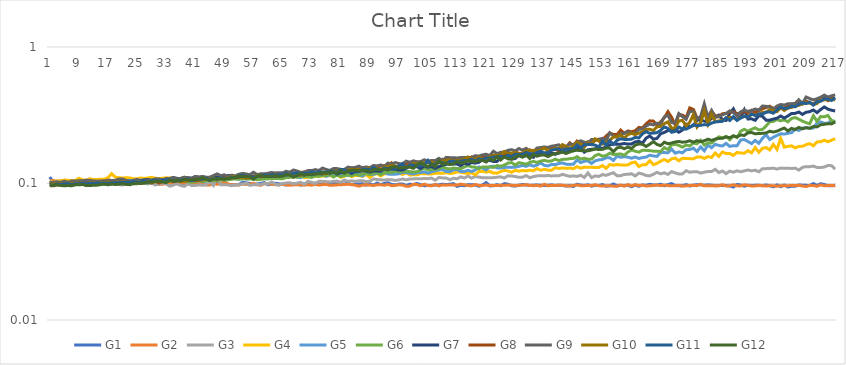
| Category | G1 | G2 | G3 | G4 | G5 | G6 | G7 | G8 | G9 | G10 | G11 | G12 |
|---|---|---|---|---|---|---|---|---|---|---|---|---|
| 0 | 0.112 | 0.105 | 0.104 | 0.104 | 0.103 | 0.099 | 0.1 | 0.096 | 0.102 | 0.099 | 0.098 | 0.098 |
| 1 | 0.101 | 0.105 | 0.103 | 0.102 | 0.101 | 0.099 | 0.1 | 0.096 | 0.102 | 0.1 | 0.097 | 0.097 |
| 2 | 0.102 | 0.103 | 0.104 | 0.105 | 0.102 | 0.098 | 0.101 | 0.098 | 0.103 | 0.1 | 0.099 | 0.098 |
| 3 | 0.103 | 0.105 | 0.099 | 0.104 | 0.102 | 0.098 | 0.101 | 0.098 | 0.102 | 0.1 | 0.099 | 0.097 |
| 4 | 0.102 | 0.105 | 0.102 | 0.106 | 0.102 | 0.098 | 0.101 | 0.098 | 0.104 | 0.1 | 0.1 | 0.096 |
| 5 | 0.103 | 0.105 | 0.102 | 0.106 | 0.102 | 0.099 | 0.101 | 0.099 | 0.102 | 0.1 | 0.1 | 0.097 |
| 6 | 0.104 | 0.104 | 0.101 | 0.105 | 0.101 | 0.099 | 0.101 | 0.098 | 0.104 | 0.101 | 0.098 | 0.096 |
| 7 | 0.105 | 0.105 | 0.1 | 0.105 | 0.102 | 0.099 | 0.101 | 0.098 | 0.104 | 0.1 | 0.1 | 0.098 |
| 8 | 0.104 | 0.106 | 0.1 | 0.109 | 0.103 | 0.098 | 0.102 | 0.098 | 0.105 | 0.101 | 0.1 | 0.098 |
| 9 | 0.104 | 0.104 | 0.099 | 0.106 | 0.103 | 0.099 | 0.101 | 0.1 | 0.105 | 0.1 | 0.1 | 0.098 |
| 10 | 0.103 | 0.104 | 0.106 | 0.105 | 0.103 | 0.098 | 0.102 | 0.099 | 0.106 | 0.1 | 0.099 | 0.096 |
| 11 | 0.102 | 0.108 | 0.1 | 0.108 | 0.103 | 0.099 | 0.102 | 0.099 | 0.105 | 0.101 | 0.1 | 0.097 |
| 12 | 0.101 | 0.104 | 0.1 | 0.107 | 0.102 | 0.099 | 0.101 | 0.1 | 0.104 | 0.101 | 0.1 | 0.097 |
| 13 | 0.103 | 0.105 | 0.101 | 0.107 | 0.103 | 0.1 | 0.103 | 0.101 | 0.104 | 0.1 | 0.101 | 0.097 |
| 14 | 0.101 | 0.107 | 0.102 | 0.108 | 0.103 | 0.1 | 0.102 | 0.1 | 0.104 | 0.101 | 0.1 | 0.098 |
| 15 | 0.1 | 0.105 | 0.1 | 0.108 | 0.102 | 0.099 | 0.103 | 0.1 | 0.105 | 0.102 | 0.101 | 0.099 |
| 16 | 0.103 | 0.102 | 0.099 | 0.11 | 0.103 | 0.101 | 0.104 | 0.099 | 0.106 | 0.102 | 0.1 | 0.098 |
| 17 | 0.101 | 0.104 | 0.1 | 0.118 | 0.104 | 0.102 | 0.104 | 0.101 | 0.105 | 0.101 | 0.101 | 0.099 |
| 18 | 0.102 | 0.106 | 0.1 | 0.111 | 0.104 | 0.1 | 0.103 | 0.101 | 0.105 | 0.102 | 0.102 | 0.098 |
| 19 | 0.101 | 0.104 | 0.099 | 0.11 | 0.104 | 0.102 | 0.103 | 0.101 | 0.108 | 0.103 | 0.101 | 0.099 |
| 20 | 0.101 | 0.104 | 0.097 | 0.11 | 0.104 | 0.101 | 0.104 | 0.101 | 0.108 | 0.103 | 0.102 | 0.1 |
| 21 | 0.102 | 0.104 | 0.099 | 0.11 | 0.105 | 0.1 | 0.105 | 0.101 | 0.105 | 0.103 | 0.102 | 0.098 |
| 22 | 0.099 | 0.104 | 0.1 | 0.11 | 0.106 | 0.101 | 0.104 | 0.1 | 0.103 | 0.102 | 0.102 | 0.098 |
| 23 | 0.101 | 0.101 | 0.099 | 0.108 | 0.104 | 0.102 | 0.104 | 0.101 | 0.106 | 0.102 | 0.103 | 0.1 |
| 24 | 0.1 | 0.104 | 0.099 | 0.108 | 0.104 | 0.101 | 0.106 | 0.101 | 0.106 | 0.102 | 0.102 | 0.1 |
| 25 | 0.101 | 0.1 | 0.102 | 0.11 | 0.106 | 0.101 | 0.104 | 0.101 | 0.103 | 0.101 | 0.102 | 0.1 |
| 26 | 0.101 | 0.102 | 0.108 | 0.109 | 0.105 | 0.101 | 0.106 | 0.101 | 0.104 | 0.102 | 0.104 | 0.101 |
| 27 | 0.1 | 0.101 | 0.1 | 0.11 | 0.104 | 0.101 | 0.107 | 0.103 | 0.105 | 0.103 | 0.102 | 0.103 |
| 28 | 0.101 | 0.103 | 0.1 | 0.111 | 0.106 | 0.102 | 0.105 | 0.101 | 0.105 | 0.102 | 0.105 | 0.102 |
| 29 | 0.101 | 0.101 | 0.098 | 0.109 | 0.106 | 0.103 | 0.108 | 0.104 | 0.108 | 0.104 | 0.104 | 0.104 |
| 30 | 0.099 | 0.099 | 0.099 | 0.109 | 0.107 | 0.103 | 0.106 | 0.101 | 0.108 | 0.103 | 0.104 | 0.104 |
| 31 | 0.102 | 0.099 | 0.101 | 0.109 | 0.106 | 0.103 | 0.107 | 0.103 | 0.106 | 0.105 | 0.105 | 0.103 |
| 32 | 0.102 | 0.1 | 0.099 | 0.11 | 0.107 | 0.105 | 0.108 | 0.103 | 0.108 | 0.103 | 0.106 | 0.102 |
| 33 | 0.101 | 0.101 | 0.096 | 0.11 | 0.107 | 0.104 | 0.108 | 0.106 | 0.109 | 0.105 | 0.106 | 0.106 |
| 34 | 0.103 | 0.1 | 0.097 | 0.11 | 0.106 | 0.104 | 0.11 | 0.103 | 0.11 | 0.105 | 0.105 | 0.104 |
| 35 | 0.1 | 0.101 | 0.1 | 0.108 | 0.106 | 0.103 | 0.109 | 0.104 | 0.108 | 0.105 | 0.105 | 0.106 |
| 36 | 0.101 | 0.101 | 0.097 | 0.109 | 0.108 | 0.105 | 0.108 | 0.105 | 0.109 | 0.104 | 0.106 | 0.104 |
| 37 | 0.1 | 0.101 | 0.095 | 0.111 | 0.108 | 0.104 | 0.111 | 0.105 | 0.111 | 0.105 | 0.107 | 0.107 |
| 38 | 0.099 | 0.1 | 0.1 | 0.11 | 0.107 | 0.103 | 0.11 | 0.105 | 0.108 | 0.105 | 0.107 | 0.106 |
| 39 | 0.101 | 0.099 | 0.097 | 0.108 | 0.108 | 0.102 | 0.11 | 0.106 | 0.108 | 0.106 | 0.105 | 0.106 |
| 40 | 0.1 | 0.099 | 0.097 | 0.108 | 0.108 | 0.103 | 0.112 | 0.105 | 0.112 | 0.107 | 0.107 | 0.108 |
| 41 | 0.099 | 0.1 | 0.098 | 0.111 | 0.107 | 0.105 | 0.111 | 0.106 | 0.112 | 0.106 | 0.107 | 0.107 |
| 42 | 0.1 | 0.099 | 0.097 | 0.11 | 0.107 | 0.104 | 0.112 | 0.106 | 0.112 | 0.108 | 0.108 | 0.111 |
| 43 | 0.099 | 0.098 | 0.098 | 0.109 | 0.107 | 0.105 | 0.111 | 0.109 | 0.111 | 0.107 | 0.109 | 0.108 |
| 44 | 0.098 | 0.097 | 0.103 | 0.109 | 0.108 | 0.107 | 0.11 | 0.107 | 0.111 | 0.108 | 0.106 | 0.105 |
| 45 | 0.101 | 0.1 | 0.097 | 0.107 | 0.109 | 0.105 | 0.112 | 0.11 | 0.114 | 0.11 | 0.109 | 0.108 |
| 46 | 0.1 | 0.099 | 0.111 | 0.111 | 0.107 | 0.105 | 0.111 | 0.107 | 0.118 | 0.108 | 0.108 | 0.109 |
| 47 | 0.099 | 0.1 | 0.098 | 0.107 | 0.108 | 0.107 | 0.111 | 0.11 | 0.114 | 0.11 | 0.11 | 0.108 |
| 48 | 0.1 | 0.102 | 0.098 | 0.111 | 0.107 | 0.106 | 0.112 | 0.11 | 0.116 | 0.108 | 0.108 | 0.108 |
| 49 | 0.098 | 0.099 | 0.098 | 0.109 | 0.108 | 0.106 | 0.114 | 0.109 | 0.112 | 0.11 | 0.109 | 0.109 |
| 50 | 0.098 | 0.098 | 0.096 | 0.109 | 0.109 | 0.107 | 0.114 | 0.11 | 0.115 | 0.112 | 0.111 | 0.11 |
| 51 | 0.098 | 0.098 | 0.098 | 0.11 | 0.109 | 0.108 | 0.11 | 0.11 | 0.114 | 0.112 | 0.11 | 0.111 |
| 52 | 0.098 | 0.097 | 0.098 | 0.113 | 0.108 | 0.108 | 0.112 | 0.111 | 0.117 | 0.114 | 0.114 | 0.113 |
| 53 | 0.102 | 0.099 | 0.099 | 0.11 | 0.109 | 0.108 | 0.114 | 0.113 | 0.119 | 0.11 | 0.115 | 0.112 |
| 54 | 0.101 | 0.098 | 0.101 | 0.11 | 0.108 | 0.108 | 0.114 | 0.11 | 0.118 | 0.111 | 0.113 | 0.113 |
| 55 | 0.1 | 0.099 | 0.097 | 0.111 | 0.109 | 0.108 | 0.111 | 0.11 | 0.116 | 0.111 | 0.112 | 0.112 |
| 56 | 0.099 | 0.1 | 0.098 | 0.114 | 0.11 | 0.108 | 0.113 | 0.112 | 0.121 | 0.111 | 0.111 | 0.107 |
| 57 | 0.099 | 0.098 | 0.098 | 0.11 | 0.109 | 0.106 | 0.115 | 0.113 | 0.116 | 0.114 | 0.112 | 0.113 |
| 58 | 0.1 | 0.097 | 0.098 | 0.11 | 0.11 | 0.107 | 0.113 | 0.112 | 0.118 | 0.114 | 0.114 | 0.115 |
| 59 | 0.102 | 0.1 | 0.1 | 0.109 | 0.11 | 0.108 | 0.114 | 0.113 | 0.118 | 0.114 | 0.115 | 0.112 |
| 60 | 0.098 | 0.099 | 0.099 | 0.112 | 0.112 | 0.108 | 0.114 | 0.113 | 0.119 | 0.113 | 0.114 | 0.113 |
| 61 | 0.099 | 0.099 | 0.103 | 0.114 | 0.111 | 0.109 | 0.113 | 0.117 | 0.12 | 0.115 | 0.116 | 0.113 |
| 62 | 0.1 | 0.098 | 0.099 | 0.112 | 0.111 | 0.109 | 0.113 | 0.113 | 0.12 | 0.116 | 0.115 | 0.114 |
| 63 | 0.1 | 0.098 | 0.097 | 0.11 | 0.111 | 0.109 | 0.114 | 0.118 | 0.12 | 0.114 | 0.116 | 0.113 |
| 64 | 0.099 | 0.098 | 0.1 | 0.113 | 0.111 | 0.108 | 0.117 | 0.118 | 0.12 | 0.114 | 0.116 | 0.113 |
| 65 | 0.097 | 0.098 | 0.101 | 0.111 | 0.112 | 0.11 | 0.115 | 0.12 | 0.123 | 0.118 | 0.119 | 0.117 |
| 66 | 0.1 | 0.097 | 0.101 | 0.112 | 0.112 | 0.111 | 0.116 | 0.117 | 0.121 | 0.115 | 0.115 | 0.116 |
| 67 | 0.1 | 0.098 | 0.099 | 0.112 | 0.114 | 0.112 | 0.115 | 0.118 | 0.126 | 0.115 | 0.119 | 0.111 |
| 68 | 0.1 | 0.098 | 0.101 | 0.113 | 0.111 | 0.111 | 0.115 | 0.118 | 0.124 | 0.117 | 0.119 | 0.115 |
| 69 | 0.097 | 0.098 | 0.102 | 0.114 | 0.11 | 0.112 | 0.117 | 0.115 | 0.121 | 0.117 | 0.118 | 0.118 |
| 70 | 0.099 | 0.097 | 0.099 | 0.11 | 0.113 | 0.113 | 0.115 | 0.122 | 0.121 | 0.118 | 0.119 | 0.115 |
| 71 | 0.1 | 0.098 | 0.104 | 0.111 | 0.114 | 0.112 | 0.12 | 0.118 | 0.124 | 0.118 | 0.118 | 0.116 |
| 72 | 0.099 | 0.097 | 0.102 | 0.113 | 0.115 | 0.111 | 0.116 | 0.12 | 0.124 | 0.121 | 0.122 | 0.116 |
| 73 | 0.101 | 0.098 | 0.1 | 0.112 | 0.114 | 0.114 | 0.118 | 0.118 | 0.126 | 0.119 | 0.119 | 0.118 |
| 74 | 0.099 | 0.097 | 0.104 | 0.113 | 0.115 | 0.113 | 0.118 | 0.122 | 0.125 | 0.121 | 0.122 | 0.118 |
| 75 | 0.098 | 0.098 | 0.104 | 0.114 | 0.116 | 0.115 | 0.117 | 0.121 | 0.13 | 0.119 | 0.121 | 0.121 |
| 76 | 0.099 | 0.098 | 0.103 | 0.114 | 0.113 | 0.114 | 0.122 | 0.121 | 0.127 | 0.118 | 0.121 | 0.119 |
| 77 | 0.099 | 0.097 | 0.103 | 0.114 | 0.116 | 0.117 | 0.119 | 0.123 | 0.125 | 0.122 | 0.123 | 0.121 |
| 78 | 0.1 | 0.097 | 0.104 | 0.114 | 0.117 | 0.112 | 0.122 | 0.123 | 0.129 | 0.122 | 0.122 | 0.121 |
| 79 | 0.099 | 0.098 | 0.104 | 0.116 | 0.116 | 0.115 | 0.117 | 0.125 | 0.129 | 0.124 | 0.121 | 0.118 |
| 80 | 0.1 | 0.098 | 0.102 | 0.111 | 0.117 | 0.112 | 0.121 | 0.124 | 0.127 | 0.124 | 0.127 | 0.125 |
| 81 | 0.099 | 0.098 | 0.106 | 0.113 | 0.115 | 0.114 | 0.12 | 0.123 | 0.127 | 0.124 | 0.126 | 0.119 |
| 82 | 0.101 | 0.099 | 0.104 | 0.117 | 0.115 | 0.115 | 0.122 | 0.124 | 0.132 | 0.126 | 0.123 | 0.124 |
| 83 | 0.098 | 0.098 | 0.105 | 0.112 | 0.115 | 0.114 | 0.119 | 0.129 | 0.13 | 0.126 | 0.122 | 0.125 |
| 84 | 0.1 | 0.097 | 0.104 | 0.115 | 0.117 | 0.117 | 0.122 | 0.128 | 0.131 | 0.127 | 0.124 | 0.125 |
| 85 | 0.099 | 0.096 | 0.104 | 0.114 | 0.116 | 0.115 | 0.122 | 0.127 | 0.134 | 0.126 | 0.123 | 0.123 |
| 86 | 0.1 | 0.097 | 0.105 | 0.113 | 0.114 | 0.118 | 0.124 | 0.131 | 0.13 | 0.126 | 0.127 | 0.125 |
| 87 | 0.097 | 0.098 | 0.103 | 0.116 | 0.119 | 0.118 | 0.123 | 0.127 | 0.132 | 0.128 | 0.127 | 0.125 |
| 88 | 0.1 | 0.097 | 0.104 | 0.111 | 0.117 | 0.116 | 0.121 | 0.13 | 0.13 | 0.129 | 0.126 | 0.123 |
| 89 | 0.097 | 0.097 | 0.108 | 0.116 | 0.117 | 0.119 | 0.123 | 0.13 | 0.136 | 0.126 | 0.131 | 0.126 |
| 90 | 0.101 | 0.098 | 0.107 | 0.118 | 0.119 | 0.12 | 0.123 | 0.129 | 0.134 | 0.131 | 0.128 | 0.127 |
| 91 | 0.098 | 0.098 | 0.106 | 0.114 | 0.119 | 0.116 | 0.123 | 0.135 | 0.137 | 0.126 | 0.126 | 0.126 |
| 92 | 0.1 | 0.097 | 0.106 | 0.118 | 0.12 | 0.12 | 0.128 | 0.135 | 0.134 | 0.133 | 0.13 | 0.128 |
| 93 | 0.101 | 0.098 | 0.107 | 0.118 | 0.117 | 0.121 | 0.127 | 0.132 | 0.141 | 0.133 | 0.128 | 0.126 |
| 94 | 0.098 | 0.096 | 0.106 | 0.118 | 0.117 | 0.12 | 0.127 | 0.141 | 0.138 | 0.135 | 0.131 | 0.132 |
| 95 | 0.098 | 0.097 | 0.105 | 0.119 | 0.117 | 0.123 | 0.127 | 0.131 | 0.142 | 0.134 | 0.129 | 0.133 |
| 96 | 0.099 | 0.098 | 0.106 | 0.119 | 0.118 | 0.122 | 0.125 | 0.134 | 0.14 | 0.132 | 0.134 | 0.129 |
| 97 | 0.099 | 0.097 | 0.108 | 0.116 | 0.121 | 0.122 | 0.126 | 0.136 | 0.14 | 0.133 | 0.139 | 0.131 |
| 98 | 0.097 | 0.095 | 0.106 | 0.12 | 0.12 | 0.123 | 0.129 | 0.138 | 0.146 | 0.134 | 0.13 | 0.131 |
| 99 | 0.099 | 0.096 | 0.108 | 0.116 | 0.119 | 0.122 | 0.134 | 0.14 | 0.143 | 0.134 | 0.136 | 0.132 |
| 100 | 0.098 | 0.099 | 0.108 | 0.116 | 0.118 | 0.122 | 0.132 | 0.142 | 0.147 | 0.14 | 0.137 | 0.129 |
| 101 | 0.1 | 0.098 | 0.108 | 0.116 | 0.12 | 0.122 | 0.133 | 0.144 | 0.144 | 0.138 | 0.135 | 0.137 |
| 102 | 0.098 | 0.096 | 0.108 | 0.118 | 0.12 | 0.126 | 0.129 | 0.14 | 0.145 | 0.142 | 0.135 | 0.142 |
| 103 | 0.096 | 0.099 | 0.109 | 0.118 | 0.122 | 0.13 | 0.134 | 0.142 | 0.149 | 0.141 | 0.136 | 0.136 |
| 104 | 0.097 | 0.097 | 0.108 | 0.118 | 0.119 | 0.126 | 0.131 | 0.143 | 0.146 | 0.143 | 0.148 | 0.133 |
| 105 | 0.097 | 0.096 | 0.11 | 0.117 | 0.122 | 0.126 | 0.133 | 0.14 | 0.148 | 0.144 | 0.137 | 0.138 |
| 106 | 0.098 | 0.098 | 0.106 | 0.119 | 0.124 | 0.128 | 0.129 | 0.146 | 0.147 | 0.141 | 0.139 | 0.133 |
| 107 | 0.098 | 0.096 | 0.111 | 0.119 | 0.126 | 0.128 | 0.133 | 0.143 | 0.153 | 0.142 | 0.144 | 0.147 |
| 108 | 0.099 | 0.098 | 0.11 | 0.119 | 0.127 | 0.133 | 0.136 | 0.15 | 0.147 | 0.146 | 0.142 | 0.138 |
| 109 | 0.098 | 0.097 | 0.11 | 0.12 | 0.122 | 0.129 | 0.138 | 0.144 | 0.155 | 0.148 | 0.139 | 0.141 |
| 110 | 0.099 | 0.098 | 0.107 | 0.118 | 0.122 | 0.128 | 0.14 | 0.15 | 0.155 | 0.149 | 0.145 | 0.138 |
| 111 | 0.1 | 0.098 | 0.109 | 0.119 | 0.126 | 0.13 | 0.139 | 0.147 | 0.155 | 0.146 | 0.146 | 0.139 |
| 112 | 0.095 | 0.097 | 0.108 | 0.122 | 0.127 | 0.129 | 0.139 | 0.148 | 0.154 | 0.148 | 0.145 | 0.146 |
| 113 | 0.097 | 0.099 | 0.112 | 0.121 | 0.122 | 0.128 | 0.135 | 0.151 | 0.155 | 0.148 | 0.146 | 0.141 |
| 114 | 0.096 | 0.098 | 0.11 | 0.119 | 0.122 | 0.132 | 0.141 | 0.152 | 0.155 | 0.152 | 0.148 | 0.143 |
| 115 | 0.098 | 0.097 | 0.113 | 0.119 | 0.125 | 0.135 | 0.138 | 0.149 | 0.156 | 0.156 | 0.148 | 0.147 |
| 116 | 0.098 | 0.096 | 0.109 | 0.12 | 0.122 | 0.132 | 0.142 | 0.157 | 0.154 | 0.152 | 0.15 | 0.145 |
| 117 | 0.098 | 0.098 | 0.113 | 0.116 | 0.126 | 0.132 | 0.141 | 0.156 | 0.16 | 0.15 | 0.146 | 0.144 |
| 118 | 0.095 | 0.097 | 0.111 | 0.122 | 0.132 | 0.128 | 0.143 | 0.153 | 0.159 | 0.156 | 0.152 | 0.148 |
| 119 | 0.097 | 0.097 | 0.11 | 0.123 | 0.13 | 0.132 | 0.15 | 0.157 | 0.162 | 0.15 | 0.149 | 0.148 |
| 120 | 0.102 | 0.098 | 0.11 | 0.121 | 0.126 | 0.132 | 0.146 | 0.16 | 0.164 | 0.154 | 0.154 | 0.144 |
| 121 | 0.096 | 0.096 | 0.11 | 0.123 | 0.133 | 0.132 | 0.148 | 0.158 | 0.16 | 0.157 | 0.154 | 0.151 |
| 122 | 0.096 | 0.097 | 0.11 | 0.119 | 0.134 | 0.131 | 0.145 | 0.158 | 0.172 | 0.161 | 0.156 | 0.148 |
| 123 | 0.098 | 0.097 | 0.111 | 0.119 | 0.13 | 0.135 | 0.145 | 0.158 | 0.165 | 0.16 | 0.156 | 0.157 |
| 124 | 0.096 | 0.097 | 0.112 | 0.122 | 0.13 | 0.134 | 0.153 | 0.161 | 0.169 | 0.162 | 0.159 | 0.149 |
| 125 | 0.1 | 0.097 | 0.11 | 0.125 | 0.131 | 0.136 | 0.156 | 0.164 | 0.17 | 0.172 | 0.156 | 0.157 |
| 126 | 0.099 | 0.097 | 0.114 | 0.124 | 0.132 | 0.141 | 0.162 | 0.169 | 0.175 | 0.165 | 0.161 | 0.152 |
| 127 | 0.096 | 0.097 | 0.114 | 0.121 | 0.131 | 0.142 | 0.151 | 0.164 | 0.177 | 0.167 | 0.157 | 0.151 |
| 128 | 0.096 | 0.096 | 0.112 | 0.125 | 0.132 | 0.136 | 0.152 | 0.17 | 0.173 | 0.169 | 0.164 | 0.156 |
| 129 | 0.097 | 0.097 | 0.111 | 0.123 | 0.134 | 0.142 | 0.161 | 0.166 | 0.18 | 0.165 | 0.163 | 0.16 |
| 130 | 0.098 | 0.097 | 0.111 | 0.124 | 0.136 | 0.14 | 0.158 | 0.164 | 0.175 | 0.168 | 0.164 | 0.156 |
| 131 | 0.098 | 0.098 | 0.114 | 0.124 | 0.134 | 0.138 | 0.16 | 0.171 | 0.181 | 0.173 | 0.169 | 0.162 |
| 132 | 0.097 | 0.097 | 0.11 | 0.125 | 0.137 | 0.143 | 0.164 | 0.177 | 0.172 | 0.174 | 0.165 | 0.152 |
| 133 | 0.097 | 0.096 | 0.112 | 0.124 | 0.134 | 0.145 | 0.156 | 0.172 | 0.172 | 0.175 | 0.164 | 0.164 |
| 134 | 0.098 | 0.097 | 0.114 | 0.129 | 0.136 | 0.143 | 0.167 | 0.177 | 0.182 | 0.173 | 0.169 | 0.158 |
| 135 | 0.097 | 0.096 | 0.114 | 0.125 | 0.142 | 0.146 | 0.167 | 0.178 | 0.183 | 0.177 | 0.172 | 0.161 |
| 136 | 0.097 | 0.099 | 0.114 | 0.127 | 0.136 | 0.148 | 0.164 | 0.183 | 0.185 | 0.182 | 0.168 | 0.162 |
| 137 | 0.097 | 0.096 | 0.114 | 0.125 | 0.134 | 0.146 | 0.16 | 0.184 | 0.184 | 0.173 | 0.168 | 0.157 |
| 138 | 0.098 | 0.097 | 0.114 | 0.125 | 0.138 | 0.146 | 0.168 | 0.182 | 0.188 | 0.177 | 0.176 | 0.163 |
| 139 | 0.097 | 0.097 | 0.114 | 0.13 | 0.137 | 0.151 | 0.164 | 0.18 | 0.189 | 0.182 | 0.178 | 0.166 |
| 140 | 0.097 | 0.097 | 0.114 | 0.129 | 0.14 | 0.147 | 0.168 | 0.173 | 0.192 | 0.18 | 0.179 | 0.167 |
| 141 | 0.097 | 0.097 | 0.117 | 0.13 | 0.141 | 0.15 | 0.171 | 0.192 | 0.181 | 0.192 | 0.173 | 0.17 |
| 142 | 0.096 | 0.096 | 0.115 | 0.129 | 0.139 | 0.15 | 0.168 | 0.184 | 0.187 | 0.187 | 0.179 | 0.166 |
| 143 | 0.096 | 0.096 | 0.113 | 0.13 | 0.138 | 0.152 | 0.176 | 0.199 | 0.194 | 0.181 | 0.18 | 0.17 |
| 144 | 0.095 | 0.097 | 0.114 | 0.128 | 0.138 | 0.152 | 0.173 | 0.19 | 0.193 | 0.188 | 0.179 | 0.174 |
| 145 | 0.099 | 0.098 | 0.113 | 0.133 | 0.149 | 0.157 | 0.18 | 0.205 | 0.2 | 0.2 | 0.192 | 0.175 |
| 146 | 0.097 | 0.096 | 0.115 | 0.13 | 0.142 | 0.151 | 0.186 | 0.197 | 0.206 | 0.195 | 0.183 | 0.174 |
| 147 | 0.097 | 0.096 | 0.111 | 0.132 | 0.146 | 0.153 | 0.17 | 0.194 | 0.201 | 0.185 | 0.192 | 0.174 |
| 148 | 0.098 | 0.097 | 0.12 | 0.132 | 0.146 | 0.151 | 0.177 | 0.202 | 0.198 | 0.198 | 0.193 | 0.173 |
| 149 | 0.096 | 0.096 | 0.11 | 0.132 | 0.14 | 0.151 | 0.178 | 0.198 | 0.21 | 0.193 | 0.193 | 0.176 |
| 150 | 0.097 | 0.098 | 0.114 | 0.131 | 0.147 | 0.16 | 0.179 | 0.207 | 0.21 | 0.212 | 0.191 | 0.179 |
| 151 | 0.096 | 0.096 | 0.113 | 0.131 | 0.149 | 0.164 | 0.183 | 0.211 | 0.21 | 0.205 | 0.185 | 0.177 |
| 152 | 0.098 | 0.096 | 0.116 | 0.136 | 0.15 | 0.158 | 0.18 | 0.209 | 0.214 | 0.194 | 0.205 | 0.178 |
| 153 | 0.096 | 0.096 | 0.115 | 0.129 | 0.154 | 0.16 | 0.186 | 0.223 | 0.206 | 0.198 | 0.19 | 0.182 |
| 154 | 0.096 | 0.096 | 0.117 | 0.138 | 0.155 | 0.167 | 0.192 | 0.235 | 0.235 | 0.208 | 0.206 | 0.182 |
| 155 | 0.099 | 0.096 | 0.12 | 0.136 | 0.148 | 0.163 | 0.195 | 0.229 | 0.223 | 0.219 | 0.194 | 0.171 |
| 156 | 0.096 | 0.096 | 0.114 | 0.138 | 0.159 | 0.164 | 0.194 | 0.228 | 0.218 | 0.22 | 0.207 | 0.182 |
| 157 | 0.097 | 0.097 | 0.114 | 0.137 | 0.156 | 0.165 | 0.194 | 0.246 | 0.231 | 0.227 | 0.212 | 0.185 |
| 158 | 0.096 | 0.096 | 0.117 | 0.136 | 0.157 | 0.161 | 0.196 | 0.233 | 0.234 | 0.215 | 0.21 | 0.18 |
| 159 | 0.097 | 0.098 | 0.117 | 0.137 | 0.156 | 0.17 | 0.194 | 0.243 | 0.24 | 0.228 | 0.21 | 0.184 |
| 160 | 0.095 | 0.096 | 0.118 | 0.142 | 0.153 | 0.176 | 0.195 | 0.239 | 0.233 | 0.233 | 0.211 | 0.181 |
| 161 | 0.098 | 0.098 | 0.114 | 0.143 | 0.156 | 0.172 | 0.202 | 0.243 | 0.232 | 0.228 | 0.218 | 0.191 |
| 162 | 0.095 | 0.097 | 0.119 | 0.133 | 0.152 | 0.17 | 0.204 | 0.258 | 0.25 | 0.234 | 0.216 | 0.195 |
| 163 | 0.098 | 0.097 | 0.117 | 0.137 | 0.155 | 0.175 | 0.197 | 0.256 | 0.251 | 0.24 | 0.231 | 0.194 |
| 164 | 0.097 | 0.096 | 0.114 | 0.138 | 0.156 | 0.175 | 0.215 | 0.274 | 0.263 | 0.249 | 0.24 | 0.187 |
| 165 | 0.099 | 0.096 | 0.114 | 0.147 | 0.161 | 0.174 | 0.223 | 0.288 | 0.273 | 0.25 | 0.233 | 0.194 |
| 166 | 0.097 | 0.097 | 0.117 | 0.137 | 0.159 | 0.173 | 0.211 | 0.287 | 0.269 | 0.244 | 0.234 | 0.203 |
| 167 | 0.098 | 0.098 | 0.121 | 0.14 | 0.158 | 0.172 | 0.214 | 0.267 | 0.277 | 0.26 | 0.236 | 0.193 |
| 168 | 0.099 | 0.096 | 0.118 | 0.146 | 0.169 | 0.171 | 0.232 | 0.282 | 0.272 | 0.262 | 0.245 | 0.189 |
| 169 | 0.096 | 0.097 | 0.12 | 0.15 | 0.168 | 0.183 | 0.236 | 0.303 | 0.307 | 0.274 | 0.26 | 0.201 |
| 170 | 0.098 | 0.097 | 0.117 | 0.145 | 0.168 | 0.177 | 0.244 | 0.336 | 0.316 | 0.283 | 0.254 | 0.196 |
| 171 | 0.1 | 0.096 | 0.122 | 0.152 | 0.179 | 0.192 | 0.246 | 0.306 | 0.28 | 0.254 | 0.237 | 0.198 |
| 172 | 0.097 | 0.096 | 0.12 | 0.154 | 0.167 | 0.193 | 0.248 | 0.269 | 0.276 | 0.256 | 0.241 | 0.202 |
| 173 | 0.096 | 0.097 | 0.117 | 0.147 | 0.17 | 0.19 | 0.237 | 0.32 | 0.325 | 0.288 | 0.259 | 0.203 |
| 174 | 0.096 | 0.096 | 0.118 | 0.153 | 0.168 | 0.185 | 0.246 | 0.317 | 0.308 | 0.29 | 0.251 | 0.201 |
| 175 | 0.098 | 0.096 | 0.124 | 0.152 | 0.177 | 0.191 | 0.272 | 0.304 | 0.295 | 0.264 | 0.25 | 0.202 |
| 176 | 0.096 | 0.097 | 0.121 | 0.152 | 0.177 | 0.188 | 0.261 | 0.358 | 0.337 | 0.281 | 0.258 | 0.206 |
| 177 | 0.097 | 0.097 | 0.122 | 0.152 | 0.181 | 0.198 | 0.265 | 0.349 | 0.338 | 0.319 | 0.269 | 0.201 |
| 178 | 0.098 | 0.096 | 0.122 | 0.156 | 0.172 | 0.195 | 0.291 | 0.302 | 0.296 | 0.259 | 0.265 | 0.206 |
| 179 | 0.098 | 0.099 | 0.119 | 0.156 | 0.185 | 0.207 | 0.292 | 0.304 | 0.31 | 0.28 | 0.267 | 0.203 |
| 180 | 0.097 | 0.096 | 0.121 | 0.153 | 0.174 | 0.191 | 0.286 | 0.35 | 0.384 | 0.339 | 0.27 | 0.206 |
| 181 | 0.098 | 0.096 | 0.122 | 0.158 | 0.191 | 0.199 | 0.283 | 0.311 | 0.304 | 0.273 | 0.268 | 0.211 |
| 182 | 0.097 | 0.096 | 0.122 | 0.155 | 0.183 | 0.198 | 0.301 | 0.339 | 0.343 | 0.324 | 0.277 | 0.207 |
| 183 | 0.096 | 0.096 | 0.127 | 0.167 | 0.194 | 0.209 | 0.307 | 0.313 | 0.306 | 0.284 | 0.282 | 0.212 |
| 184 | 0.097 | 0.096 | 0.12 | 0.158 | 0.19 | 0.22 | 0.317 | 0.309 | 0.309 | 0.288 | 0.284 | 0.214 |
| 185 | 0.097 | 0.098 | 0.123 | 0.17 | 0.188 | 0.216 | 0.293 | 0.325 | 0.318 | 0.289 | 0.285 | 0.214 |
| 186 | 0.097 | 0.096 | 0.118 | 0.166 | 0.197 | 0.221 | 0.29 | 0.326 | 0.326 | 0.302 | 0.303 | 0.22 |
| 187 | 0.096 | 0.096 | 0.123 | 0.166 | 0.187 | 0.209 | 0.326 | 0.333 | 0.34 | 0.304 | 0.29 | 0.216 |
| 188 | 0.094 | 0.098 | 0.121 | 0.161 | 0.189 | 0.222 | 0.352 | 0.336 | 0.331 | 0.303 | 0.309 | 0.224 |
| 189 | 0.098 | 0.096 | 0.124 | 0.169 | 0.189 | 0.217 | 0.312 | 0.325 | 0.315 | 0.294 | 0.29 | 0.219 |
| 190 | 0.097 | 0.096 | 0.122 | 0.168 | 0.208 | 0.242 | 0.305 | 0.328 | 0.334 | 0.304 | 0.302 | 0.227 |
| 191 | 0.096 | 0.098 | 0.124 | 0.166 | 0.21 | 0.25 | 0.347 | 0.34 | 0.345 | 0.31 | 0.31 | 0.225 |
| 192 | 0.097 | 0.097 | 0.126 | 0.174 | 0.203 | 0.242 | 0.297 | 0.328 | 0.338 | 0.305 | 0.305 | 0.235 |
| 193 | 0.096 | 0.096 | 0.124 | 0.168 | 0.196 | 0.249 | 0.298 | 0.344 | 0.342 | 0.321 | 0.324 | 0.236 |
| 194 | 0.097 | 0.096 | 0.125 | 0.184 | 0.207 | 0.256 | 0.29 | 0.331 | 0.351 | 0.32 | 0.314 | 0.231 |
| 195 | 0.097 | 0.097 | 0.122 | 0.169 | 0.197 | 0.247 | 0.314 | 0.341 | 0.345 | 0.321 | 0.323 | 0.233 |
| 196 | 0.096 | 0.096 | 0.128 | 0.181 | 0.215 | 0.249 | 0.311 | 0.353 | 0.369 | 0.333 | 0.323 | 0.233 |
| 197 | 0.098 | 0.096 | 0.128 | 0.183 | 0.228 | 0.264 | 0.291 | 0.36 | 0.368 | 0.333 | 0.332 | 0.235 |
| 198 | 0.096 | 0.096 | 0.129 | 0.176 | 0.21 | 0.283 | 0.291 | 0.368 | 0.363 | 0.348 | 0.335 | 0.242 |
| 199 | 0.095 | 0.096 | 0.13 | 0.193 | 0.218 | 0.285 | 0.296 | 0.355 | 0.351 | 0.343 | 0.327 | 0.238 |
| 200 | 0.098 | 0.096 | 0.128 | 0.178 | 0.225 | 0.294 | 0.301 | 0.359 | 0.37 | 0.336 | 0.346 | 0.242 |
| 201 | 0.095 | 0.096 | 0.13 | 0.215 | 0.232 | 0.288 | 0.312 | 0.356 | 0.379 | 0.359 | 0.363 | 0.248 |
| 202 | 0.097 | 0.096 | 0.129 | 0.185 | 0.23 | 0.292 | 0.302 | 0.358 | 0.376 | 0.343 | 0.354 | 0.255 |
| 203 | 0.094 | 0.096 | 0.13 | 0.187 | 0.233 | 0.283 | 0.313 | 0.373 | 0.384 | 0.358 | 0.357 | 0.243 |
| 204 | 0.095 | 0.097 | 0.129 | 0.189 | 0.236 | 0.3 | 0.326 | 0.381 | 0.384 | 0.361 | 0.368 | 0.253 |
| 205 | 0.096 | 0.097 | 0.13 | 0.182 | 0.25 | 0.304 | 0.326 | 0.367 | 0.386 | 0.368 | 0.365 | 0.248 |
| 206 | 0.098 | 0.097 | 0.125 | 0.187 | 0.244 | 0.296 | 0.334 | 0.397 | 0.41 | 0.374 | 0.381 | 0.258 |
| 207 | 0.097 | 0.096 | 0.131 | 0.187 | 0.255 | 0.286 | 0.321 | 0.382 | 0.385 | 0.385 | 0.389 | 0.252 |
| 208 | 0.097 | 0.095 | 0.133 | 0.192 | 0.257 | 0.279 | 0.333 | 0.402 | 0.43 | 0.392 | 0.385 | 0.256 |
| 209 | 0.097 | 0.097 | 0.133 | 0.196 | 0.254 | 0.274 | 0.336 | 0.392 | 0.419 | 0.388 | 0.394 | 0.254 |
| 210 | 0.1 | 0.097 | 0.134 | 0.189 | 0.255 | 0.314 | 0.346 | 0.382 | 0.41 | 0.379 | 0.375 | 0.262 |
| 211 | 0.097 | 0.096 | 0.131 | 0.202 | 0.278 | 0.285 | 0.331 | 0.401 | 0.418 | 0.385 | 0.398 | 0.26 |
| 212 | 0.1 | 0.098 | 0.131 | 0.202 | 0.283 | 0.309 | 0.348 | 0.408 | 0.428 | 0.409 | 0.4 | 0.27 |
| 213 | 0.098 | 0.096 | 0.132 | 0.208 | 0.276 | 0.308 | 0.364 | 0.424 | 0.444 | 0.41 | 0.417 | 0.272 |
| 214 | 0.096 | 0.097 | 0.136 | 0.202 | 0.277 | 0.315 | 0.35 | 0.405 | 0.43 | 0.413 | 0.415 | 0.274 |
| 215 | 0.096 | 0.097 | 0.135 | 0.208 | 0.289 | 0.289 | 0.344 | 0.419 | 0.439 | 0.413 | 0.406 | 0.273 |
| 216 | 0.097 | 0.096 | 0.128 | 0.213 | 0.278 | 0.285 | 0.34 | 0.422 | 0.446 | 0.41 | 0.424 | 0.283 |